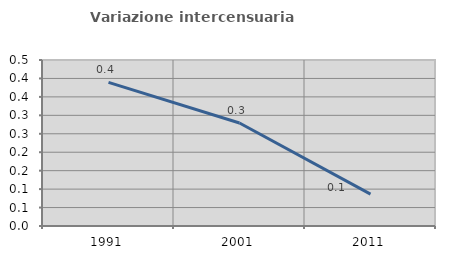
| Category | Variazione intercensuaria annua |
|---|---|
| 1991.0 | 0.389 |
| 2001.0 | 0.279 |
| 2011.0 | 0.086 |